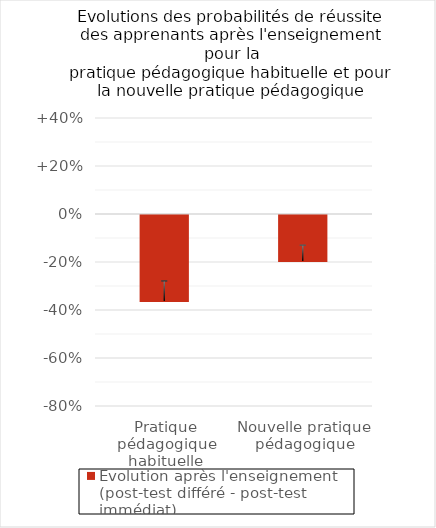
| Category | Evolution après l'enseignement
(post-test différé - post-test immédiat) |
|---|---|
| Pratique pédagogique habituelle | -0.362 |
| Nouvelle pratique pédagogique | -0.196 |